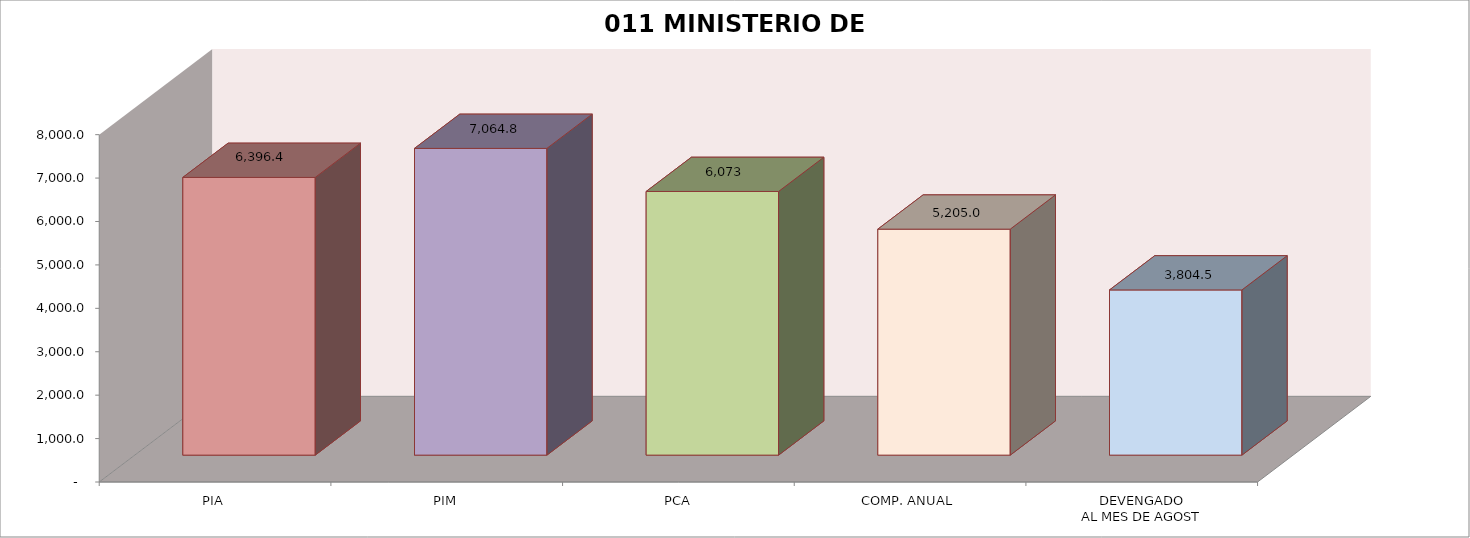
| Category | 011 MINISTERIO DE SALUD |
|---|---|
| PIA | 6396.414 |
| PIM | 7064.793 |
| PCA | 6072.739 |
| COMP. ANUAL | 5204.973 |
| DEVENGADO
AL MES DE AGOST | 3804.472 |